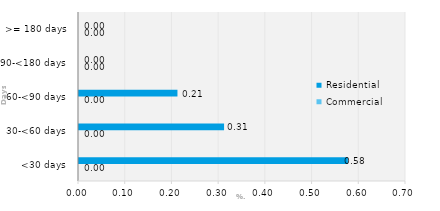
| Category | Commercial | Residential |
|---|---|---|
| <30 days | 0 | 0.576 |
| 30-<60 days | 0 | 0.311 |
| 60-<90 days | 0 | 0.211 |
| 90-<180 days | 0 | 0 |
| >= 180 days | 0 | 0 |